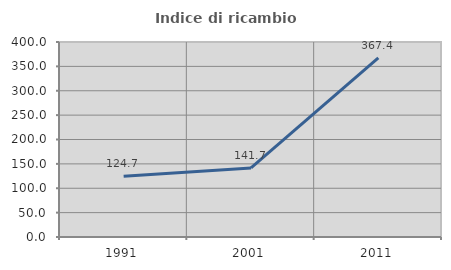
| Category | Indice di ricambio occupazionale  |
|---|---|
| 1991.0 | 124.678 |
| 2001.0 | 141.728 |
| 2011.0 | 367.45 |